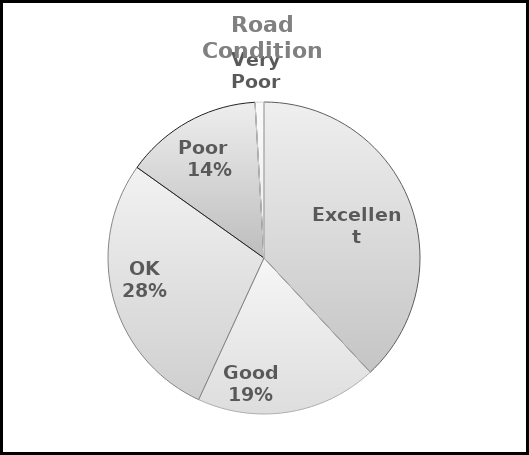
| Category | Series 0 | Series 1 |
|---|---|---|
| Excellent | 8.3 | 8.3 |
| Good | 4.1 | 4.1 |
| OK | 6.1 | 6.1 |
| Poor    | 3.1 | 3.1 |
| Very Poor | 0.2 | 0.2 |